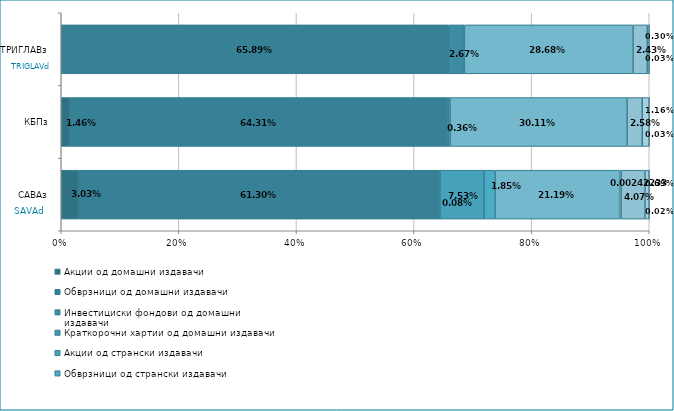
| Category | Акции од домашни издавачи  | Обврзници од домашни издавачи  | Инвестициски фондови од домашни издавачи  | Краткорочни хартии од домашни издавачи  | Акции од странски издавачи  | Обврзници од странски издавачи  | Инвестициски фондови од странски издавaчи | Краткорочни хартии од странски издавачи  | Депозити  | Парични средства  | Побарувања |
|---|---|---|---|---|---|---|---|---|---|---|---|
| САВАз | 0.03 | 0.613 | 0.001 | 0 | 0.075 | 0.018 | 0.212 | 0.002 | 0.041 | 0.007 | 0 |
| КБПз | 0.015 | 0.643 | 0.004 | 0 | 0 | 0 | 0.301 | 0 | 0.026 | 0.012 | 0 |
| ТРИГЛАВз | 0 | 0.659 | 0.027 | 0 | 0 | 0 | 0.287 | 0 | 0.024 | 0.003 | 0 |